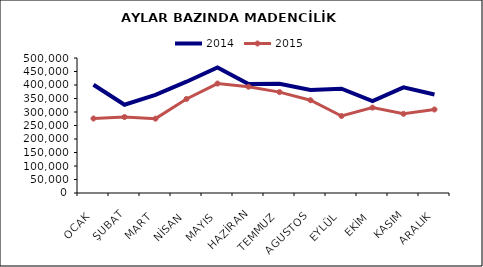
| Category | 2014 | 2015 |
|---|---|---|
| OCAK | 400841.502 | 275912.264 |
| ŞUBAT | 327054.988 | 281272.031 |
| MART | 363215.163 | 275414.299 |
| NİSAN | 412190.479 | 348267.768 |
| MAYIS | 465269.183 | 405337.124 |
| HAZİRAN | 404037.654 | 393589.097 |
| TEMMUZ | 404536.068 | 373661.464 |
| AGUSTOS | 381295.276 | 343531.219 |
| EYLÜL | 386343.806 | 285231.307 |
| EKİM | 340422.889 | 316290.411 |
| KASIM | 391401.331 | 293236.565 |
| ARALIK | 364933.194 | 309310.795 |